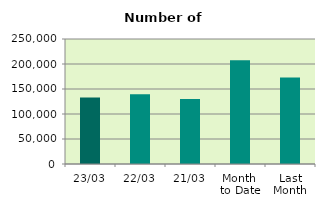
| Category | Series 0 |
|---|---|
| 23/03 | 132882 |
| 22/03 | 139736 |
| 21/03 | 130012 |
| Month 
to Date | 207641.529 |
| Last
Month | 173197.3 |